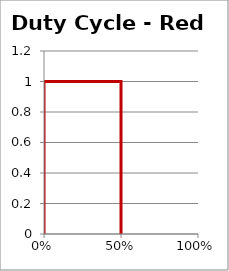
| Category | Red |
|---|---|
| 0.0 | 0 |
| 0.0 | 1 |
| 0.5 | 1 |
| 0.5 | 0 |